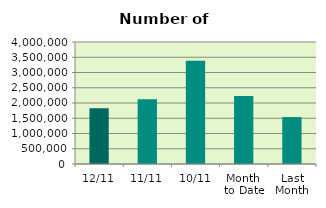
| Category | Series 0 |
|---|---|
| 12/11 | 1825826 |
| 11/11 | 2125006 |
| 10/11 | 3382152 |
| Month 
to Date | 2231414.222 |
| Last
Month | 1538680.909 |